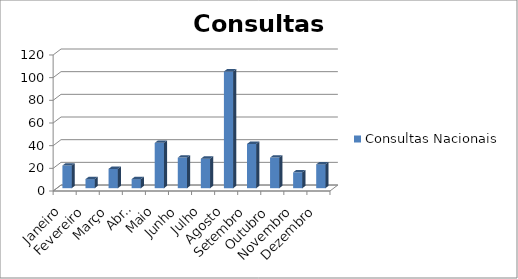
| Category | Consultas Nacionais |
|---|---|
| Janeiro | 20 |
| Fevereiro | 8 |
| Março | 17 |
| Abril | 8 |
| Maio | 40 |
| Junho | 27 |
| Julho | 26 |
| Agosto | 103 |
| Setembro | 39 |
| Outubro | 27 |
| Novembro | 14 |
| Dezembro | 21 |